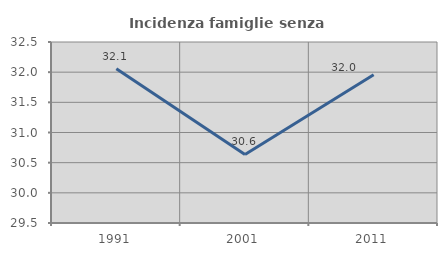
| Category | Incidenza famiglie senza nuclei |
|---|---|
| 1991.0 | 32.056 |
| 2001.0 | 30.636 |
| 2011.0 | 31.956 |